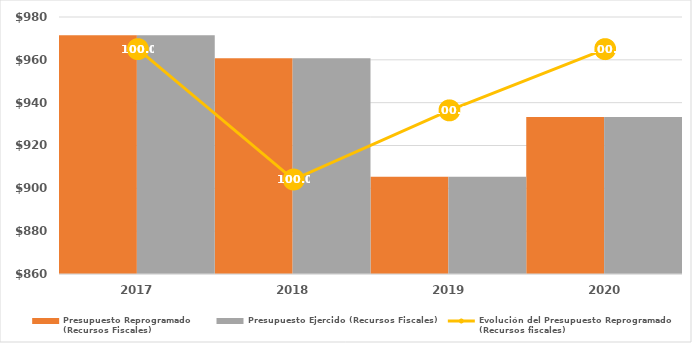
| Category | Presupuesto Reprogramado
(Recursos Fiscales) | Presupuesto Ejercido (Recursos Fiscales) |
|---|---|---|
| 2017.0 | 971443.512 | 971443.512 |
| 2018.0 | 960785 | 960707 |
| 2019.0 | 905415.253 | 905380.73 |
| 2020.0 | 933283.136 | 933283.136 |